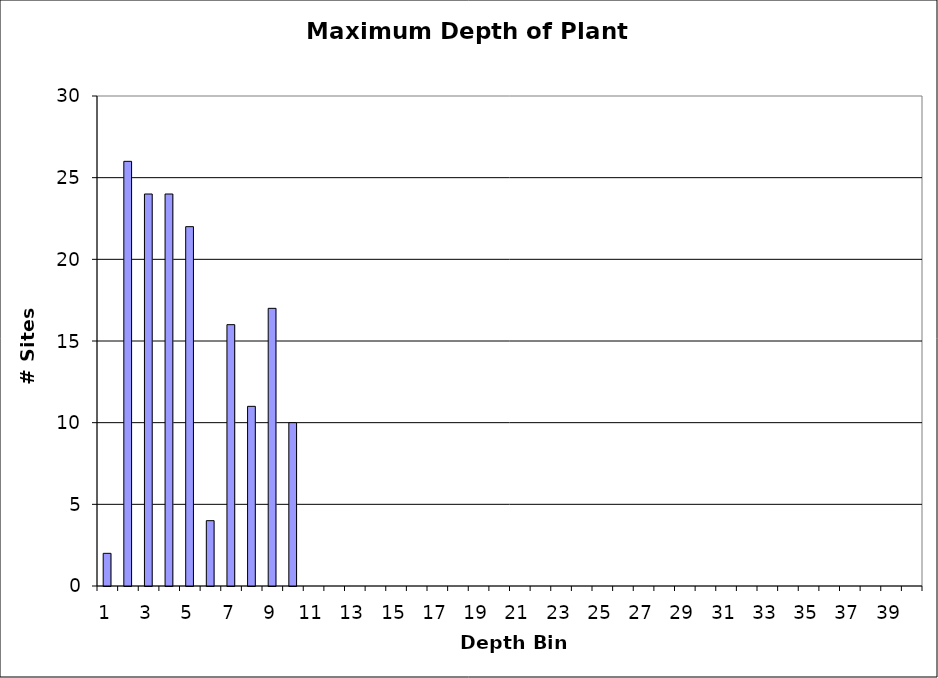
| Category | Series 0 |
|---|---|
| 1.0 | 2 |
| 2.0 | 26 |
| 3.0 | 24 |
| 4.0 | 24 |
| 5.0 | 22 |
| 6.0 | 4 |
| 7.0 | 16 |
| 8.0 | 11 |
| 9.0 | 17 |
| 10.0 | 10 |
| 11.0 | 0 |
| 12.0 | 0 |
| 13.0 | 0 |
| 14.0 | 0 |
| 15.0 | 0 |
| 16.0 | 0 |
| 17.0 | 0 |
| 18.0 | 0 |
| 19.0 | 0 |
| 20.0 | 0 |
| 21.0 | 0 |
| 22.0 | 0 |
| 23.0 | 0 |
| 24.0 | 0 |
| 25.0 | 0 |
| 26.0 | 0 |
| 27.0 | 0 |
| 28.0 | 0 |
| 29.0 | 0 |
| 30.0 | 0 |
| 31.0 | 0 |
| 32.0 | 0 |
| 33.0 | 0 |
| 34.0 | 0 |
| 35.0 | 0 |
| 36.0 | 0 |
| 37.0 | 0 |
| 38.0 | 0 |
| 39.0 | 0 |
| 40.0 | 0 |